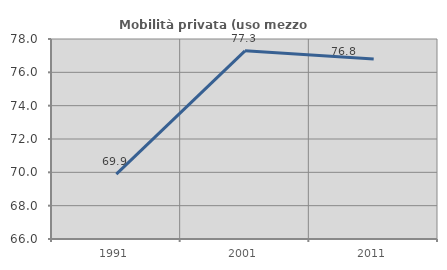
| Category | Mobilità privata (uso mezzo privato) |
|---|---|
| 1991.0 | 69.888 |
| 2001.0 | 77.29 |
| 2011.0 | 76.804 |